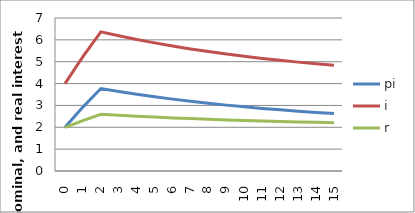
| Category | pi | i | r |
|---|---|---|---|
| 0.0 | 2 | 4 | 2 |
| 1.0 | 2.923 | 5.231 | 2.308 |
| 2.0 | 3.775 | 6.367 | 2.592 |
| 3.0 | 3.639 | 6.185 | 2.546 |
| 4.0 | 3.513 | 6.017 | 2.504 |
| 5.0 | 3.396 | 5.862 | 2.465 |
| 6.0 | 3.289 | 5.718 | 2.43 |
| 7.0 | 3.19 | 5.586 | 2.397 |
| 8.0 | 3.098 | 5.464 | 2.366 |
| 9.0 | 3.014 | 5.352 | 2.338 |
| 10.0 | 2.936 | 5.248 | 2.312 |
| 11.0 | 2.864 | 5.152 | 2.288 |
| 12.0 | 2.797 | 5.063 | 2.266 |
| 13.0 | 2.736 | 4.981 | 2.245 |
| 14.0 | 2.679 | 4.906 | 2.226 |
| 15.0 | 2.627 | 4.836 | 2.209 |